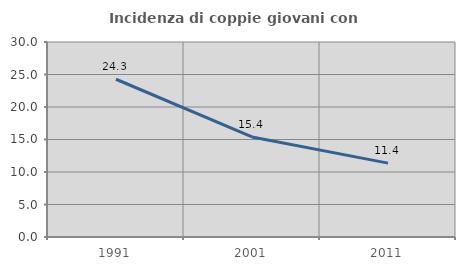
| Category | Incidenza di coppie giovani con figli |
|---|---|
| 1991.0 | 24.269 |
| 2001.0 | 15.388 |
| 2011.0 | 11.363 |